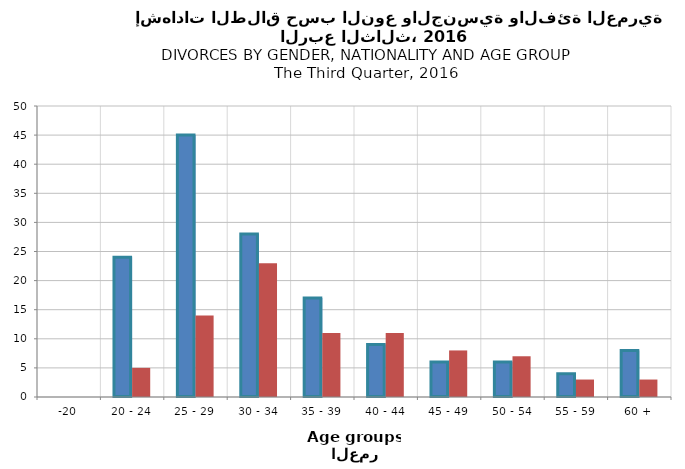
| Category | ذكور قطريون
Qatari Males | ذكور غير قطريين
Non-Qatari Males |
|---|---|---|
| -20 | 0 | 0 |
| 20 - 24 | 24 | 5 |
| 25 - 29 | 45 | 14 |
| 30 - 34 | 28 | 23 |
| 35 - 39 | 17 | 11 |
| 40 - 44 | 9 | 11 |
| 45 - 49 | 6 | 8 |
| 50 - 54 | 6 | 7 |
| 55 - 59 | 4 | 3 |
| 60 + | 8 | 3 |